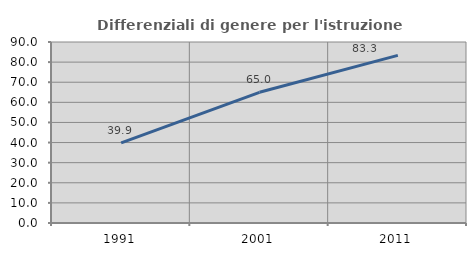
| Category | Differenziali di genere per l'istruzione superiore |
|---|---|
| 1991.0 | 39.867 |
| 2001.0 | 64.977 |
| 2011.0 | 83.333 |